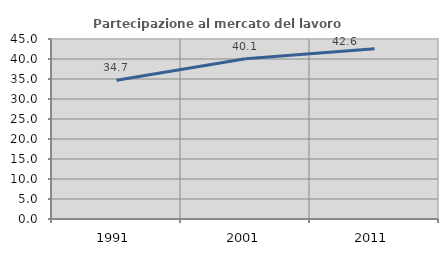
| Category | Partecipazione al mercato del lavoro  femminile |
|---|---|
| 1991.0 | 34.685 |
| 2001.0 | 40.056 |
| 2011.0 | 42.58 |